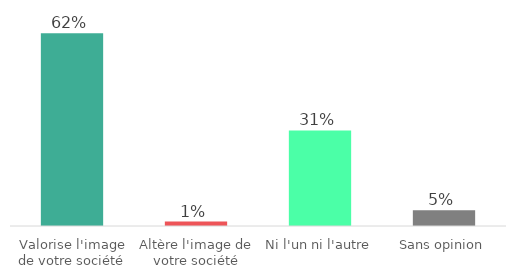
| Category | Series 0 |
|---|---|
| Valorise l'image de votre société | 62.491 |
| Altère l'image de votre société | 1.439 |
| Ni l'un ni l'autre | 30.977 |
| Sans opinion | 5.093 |